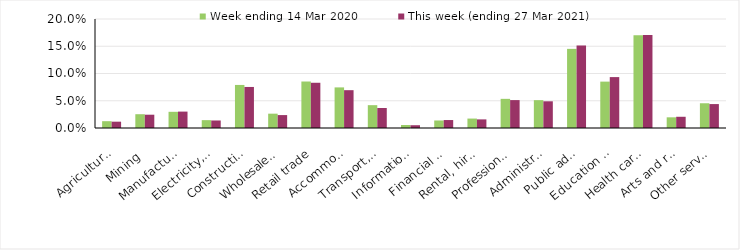
| Category | Week ending 14 Mar 2020 | This week (ending 27 Mar 2021) |
|---|---|---|
| Agriculture, forestry and fishing | 0.012 | 0.012 |
| Mining | 0.025 | 0.024 |
| Manufacturing | 0.03 | 0.03 |
| Electricity, gas, water and waste services | 0.014 | 0.014 |
| Construction | 0.079 | 0.075 |
| Wholesale trade | 0.026 | 0.024 |
| Retail trade | 0.085 | 0.083 |
| Accommodation and food services | 0.074 | 0.069 |
| Transport, postal and warehousing | 0.042 | 0.037 |
| Information media and telecommunications | 0.006 | 0.005 |
| Financial and insurance services | 0.014 | 0.015 |
| Rental, hiring and real estate services | 0.017 | 0.016 |
| Professional, scientific and technical services | 0.054 | 0.051 |
| Administrative and support services | 0.051 | 0.049 |
| Public administration and safety | 0.145 | 0.151 |
| Education and training | 0.085 | 0.093 |
| Health care and social assistance | 0.17 | 0.171 |
| Arts and recreation services | 0.02 | 0.021 |
| Other services | 0.045 | 0.044 |